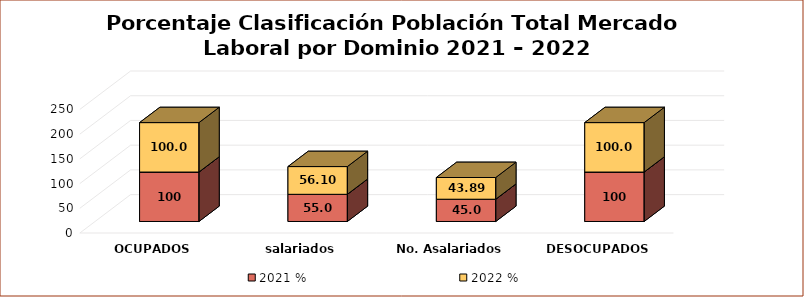
| Category | 2021 | 2022 |
|---|---|---|
| OCUPADOS | 100 | 100 |
| salariados | 54.957 | 56.1 |
| No. Asalariados | 45.043 | 43.887 |
| DESOCUPADOS | 100 | 100 |